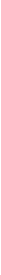
| Category | Series 0 | Series 1 | Series 2 | Series 3 |
|---|---|---|---|---|
| 1996-01-01 | 63.62 | 26.95 | 39.91 | 71.02 |
| 1997-01-01 | 62.04 | 25.74 | 41.27 | 66.87 |
| 1998-01-01 | 62.51 | 21.13 | 42.79 | 65.23 |
| 1999-01-01 | 60.65 | 23.83 | 41.91 | 64.63 |
| 2000-01-01 | 59.93 | 34.03 | 45.01 | 59.13 |
| 2001-01-01 | 68.04 | 33.39 | 62.23 | 56.19 |
| 2002-01-01 | 68.05 | 34.22 | 59.08 | 53.86 |
| 2003-01-01 | 61.45 | 38.52 | 59.64 | 50.82 |
| 2004-01-01 | 65.87 | 37.8 | 63.94 | 53.82 |
| 2005-01-01 | 73.94 | 48.78 | 92.55 | 68.54 |
| 2006-01-01 | 68.97 | 60.38 | 111.21 | 88.5 |
| 2007-01-01 | 77.26 | 61.04 | 87.59 | 88.3 |
| 2008-01-01 | 95.18 | 86.14 | 127.19 | 105.2 |
| 2009-01-01 | 88.36 | 82.44 | 106.13 | 111.42 |
| 2010-01-01 | 100 | 100 | 100 | 100 |
| 2011-01-01 | 107.98 | 118.7 | 119.5 | 100.87 |
| 2012-01-01 | 104.03 | 124.17 | 128.37 | 104.14 |
| 2013-01-01 | 106.97 | 117.74 | 138.91 | 107.09 |
| 2014-01-01 | 105.47 | 103.6 | 123.42 | 111.4 |